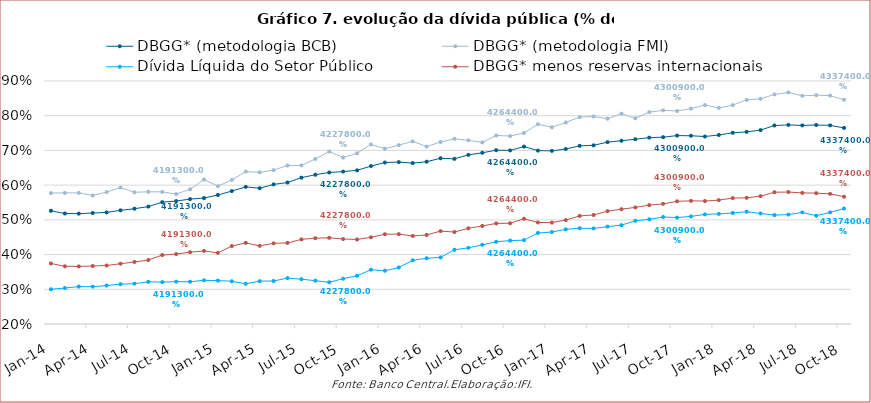
| Category | DBGG* (metodologia BCB) | DBGG* (metodologia FMI) | Dívida Líquida do Setor Público | DBGG* menos reservas internacionais |
|---|---|---|---|---|
| 2014-01-01 | 0.526 | 0.577 | 0.3 | 0.374 |
| 2014-02-01 | 0.518 | 0.578 | 0.304 | 0.366 |
| 2014-03-01 | 0.518 | 0.578 | 0.308 | 0.366 |
| 2014-04-01 | 0.52 | 0.57 | 0.308 | 0.367 |
| 2014-05-01 | 0.521 | 0.58 | 0.311 | 0.369 |
| 2014-06-01 | 0.527 | 0.593 | 0.315 | 0.374 |
| 2014-07-01 | 0.532 | 0.579 | 0.316 | 0.379 |
| 2014-08-01 | 0.538 | 0.581 | 0.321 | 0.384 |
| 2014-09-01 | 0.551 | 0.581 | 0.321 | 0.399 |
| 2014-10-01 | 0.554 | 0.574 | 0.322 | 0.401 |
| 2014-11-01 | 0.56 | 0.588 | 0.322 | 0.407 |
| 2014-12-01 | 0.563 | 0.616 | 0.326 | 0.41 |
| 2015-01-01 | 0.572 | 0.597 | 0.325 | 0.405 |
| 2015-02-01 | 0.583 | 0.615 | 0.323 | 0.424 |
| 2015-03-01 | 0.595 | 0.639 | 0.316 | 0.434 |
| 2015-04-01 | 0.591 | 0.637 | 0.323 | 0.425 |
| 2015-05-01 | 0.602 | 0.643 | 0.324 | 0.432 |
| 2015-06-01 | 0.607 | 0.657 | 0.332 | 0.434 |
| 2015-07-01 | 0.622 | 0.657 | 0.329 | 0.444 |
| 2015-08-01 | 0.63 | 0.675 | 0.325 | 0.447 |
| 2015-09-01 | 0.636 | 0.697 | 0.32 | 0.448 |
| 2015-10-01 | 0.639 | 0.679 | 0.331 | 0.445 |
| 2015-11-01 | 0.643 | 0.692 | 0.339 | 0.444 |
| 2015-12-01 | 0.655 | 0.717 | 0.356 | 0.45 |
| 2016-01-01 | 0.665 | 0.705 | 0.353 | 0.459 |
| 2016-02-01 | 0.666 | 0.715 | 0.363 | 0.459 |
| 2016-03-01 | 0.664 | 0.726 | 0.383 | 0.454 |
| 2016-04-01 | 0.667 | 0.711 | 0.389 | 0.457 |
| 2016-05-01 | 0.677 | 0.724 | 0.392 | 0.468 |
| 2016-06-01 | 0.676 | 0.733 | 0.414 | 0.465 |
| 2016-07-01 | 0.687 | 0.729 | 0.419 | 0.476 |
| 2016-08-01 | 0.693 | 0.723 | 0.428 | 0.482 |
| 2016-09-01 | 0.701 | 0.743 | 0.437 | 0.49 |
| 2016-10-01 | 0.7 | 0.741 | 0.44 | 0.49 |
| 2016-11-01 | 0.711 | 0.75 | 0.442 | 0.503 |
| 2016-12-01 | 0.7 | 0.775 | 0.462 | 0.492 |
| 2017-01-01 | 0.699 | 0.767 | 0.465 | 0.492 |
| 2017-02-01 | 0.704 | 0.78 | 0.473 | 0.5 |
| 2017-03-01 | 0.713 | 0.796 | 0.476 | 0.511 |
| 2017-04-01 | 0.715 | 0.798 | 0.475 | 0.514 |
| 2017-05-01 | 0.724 | 0.791 | 0.48 | 0.525 |
| 2017-06-01 | 0.728 | 0.806 | 0.485 | 0.531 |
| 2017-07-01 | 0.732 | 0.793 | 0.497 | 0.536 |
| 2017-08-01 | 0.737 | 0.81 | 0.502 | 0.542 |
| 2017-09-01 | 0.738 | 0.816 | 0.508 | 0.546 |
| 2017-10-01 | 0.743 | 0.813 | 0.507 | 0.553 |
| 2017-11-01 | 0.742 | 0.82 | 0.51 | 0.555 |
| 2017-12-01 | 0.74 | 0.831 | 0.516 | 0.554 |
| 2018-01-01 | 0.744 | 0.822 | 0.517 | 0.557 |
| 2018-02-01 | 0.751 | 0.831 | 0.52 | 0.563 |
| 2018-03-01 | 0.753 | 0.845 | 0.523 | 0.563 |
| 2018-04-01 | 0.759 | 0.849 | 0.518 | 0.568 |
| 2018-05-01 | 0.772 | 0.861 | 0.514 | 0.58 |
| 2018-06-01 | 0.773 | 0.867 | 0.515 | 0.58 |
| 2018-07-01 | 0.772 | 0.857 | 0.522 | 0.578 |
| 2018-08-01 | 0.773 | 0.859 | 0.512 | 0.577 |
| 2018-09-01 | 0.772 | 0.858 | 0.521 | 0.575 |
| 2018-10-01 | 0.765 | 0.846 | 0.533 | 0.567 |